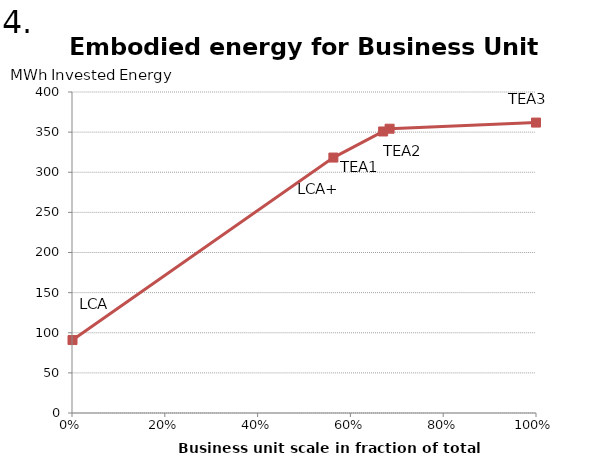
| Category | E invest |
|---|---|
| 0.0010925338773912676 | 90.891 |
| 0.5633281909178405 | 318.311 |
| 0.6705604829002757 | 350.811 |
| 0.6844816293059246 | 354.256 |
| 1.0 | 361.898 |